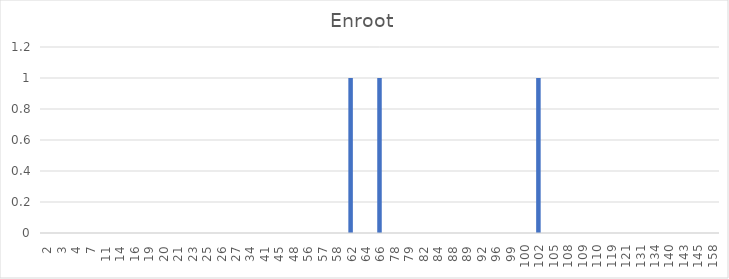
| Category | Series 0 |
|---|---|
| 2.0 | 0 |
| 3.0 | 0 |
| 4.0 | 0 |
| 7.0 | 0 |
| 11.0 | 0 |
| 14.0 | 0 |
| 16.0 | 0 |
| 19.0 | 0 |
| 20.0 | 0 |
| 21.0 | 0 |
| 23.0 | 0 |
| 25.0 | 0 |
| 26.0 | 0 |
| 27.0 | 0 |
| 34.0 | 0 |
| 41.0 | 0 |
| 45.0 | 0 |
| 48.0 | 0 |
| 56.0 | 0 |
| 57.0 | 0 |
| 58.0 | 0 |
| 62.0 | 1 |
| 64.0 | 0 |
| 66.0 | 1 |
| 78.0 | 0 |
| 79.0 | 0 |
| 82.0 | 0 |
| 84.0 | 0 |
| 88.0 | 0 |
| 89.0 | 0 |
| 92.0 | 0 |
| 96.0 | 0 |
| 99.0 | 0 |
| 100.0 | 0 |
| 102.0 | 1 |
| 105.0 | 0 |
| 108.0 | 0 |
| 109.0 | 0 |
| 110.0 | 0 |
| 119.0 | 0 |
| 121.0 | 0 |
| 131.0 | 0 |
| 134.0 | 0 |
| 140.0 | 0 |
| 143.0 | 0 |
| 145.0 | 0 |
| 158.0 | 0 |